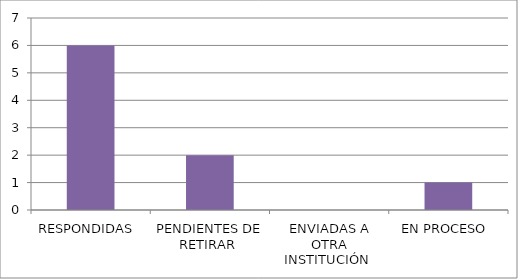
| Category | Series 0 |
|---|---|
| RESPONDIDAS  | 6 |
| PENDIENTES DE RETIRAR  | 2 |
| ENVIADAS A OTRA INSTITUCIÓN  | 0 |
| EN PROCESO  | 1 |